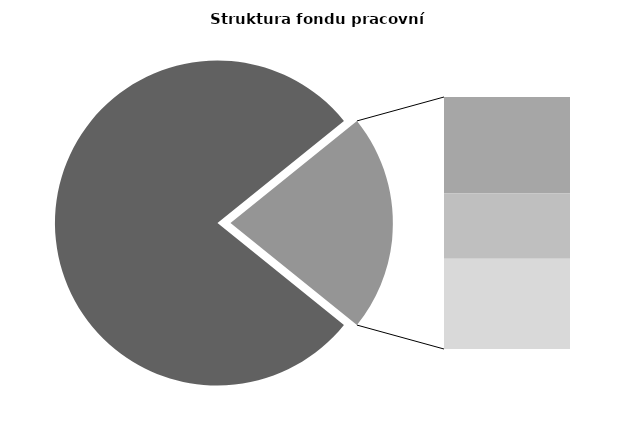
| Category | Series 0 |
|---|---|
| Průměrná měsíční odpracovaná doba bez přesčasu | 134.134 |
| Dovolená | 14.131 |
| Nemoc | 9.615 |
| Jiné | 13.249 |